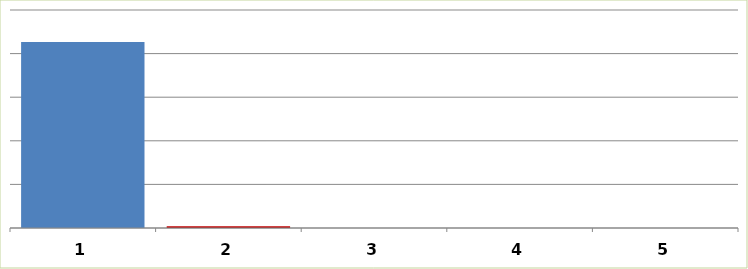
| Category | Series 0 |
|---|---|
| 0 | 2134324.81 |
| 1 | 18967.2 |
| 2 | 0 |
| 3 | 0 |
| 4 | 0 |